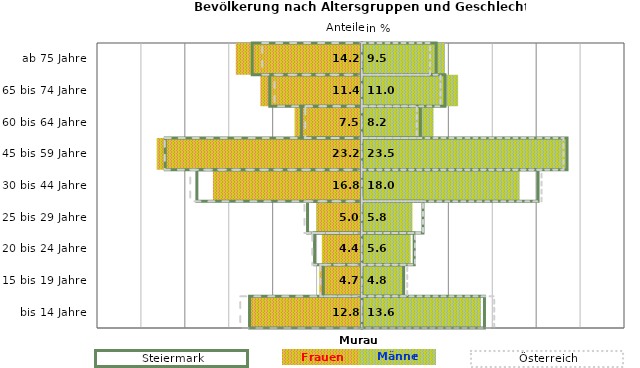
| Category | Frauen | Männer | Frauen Spalte2 | Männer Spalte2 | Frauen Spalte3 | Männer Spalte3 |
|---|---|---|---|---|---|---|
| bis 14 Jahre | -12.8 | 13.6 | 14 | -12.8 | -13.8 | 15.1 |
| 15 bis 19 Jahre | -4.7 | 4.8 | 4.8 | -4.4 | -4.7 | 5.2 |
| 20 bis 24 Jahre | -4.4 | 5.6 | 6 | -5.4 | -5.6 | 6.1 |
| 25 bis 29 Jahre | -5 | 5.8 | 7 | -6.2 | -6.5 | 7 |
| 30 bis 44 Jahre | -16.8 | 18 | 20.1 | -18.8 | -19.5 | 20.5 |
| 45 bis 59 Jahre | -23.2 | 23.5 | 23.4 | -22.4 | -22.4 | 23 |
| 60 bis 64 Jahre | -7.5 | 8.2 | 6.7 | -6.9 | -6.4 | 6.3 |
| 65 bis 74 Jahre | -11.4 | 11 | 9.5 | -10.5 | -9.9 | 9 |
| ab 75 Jahre | -14.2 | 9.5 | 8.5 | -12.5 | -11.3 | 7.8 |